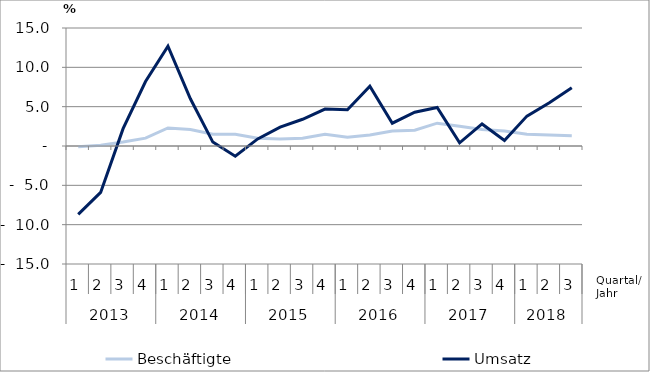
| Category | Beschäftigte | Umsatz |
|---|---|---|
| 0 | -0.1 | -8.7 |
| 1 | 0.1 | -5.9 |
| 2 | 0.5 | 2.2 |
| 3 | 1 | 8.2 |
| 4 | 2.3 | 12.7 |
| 5 | 2.1 | 6 |
| 6 | 1.5 | 0.5 |
| 7 | 1.5 | -1.3 |
| 8 | 1 | 0.9 |
| 9 | 0.9 | 2.4 |
| 10 | 1 | 3.4 |
| 11 | 1.5 | 4.7 |
| 12 | 1.1 | 4.6 |
| 13 | 1.4 | 7.6 |
| 14 | 1.9 | 2.9 |
| 15 | 2 | 4.3 |
| 16 | 2.9 | 4.9 |
| 17 | 2.5 | 0.4 |
| 18 | 2.1 | 2.8 |
| 19 | 1.9 | 0.7 |
| 20 | 1.5 | 3.8 |
| 21 | 1.4 | 5.5 |
| 22 | 1.3 | 7.4 |